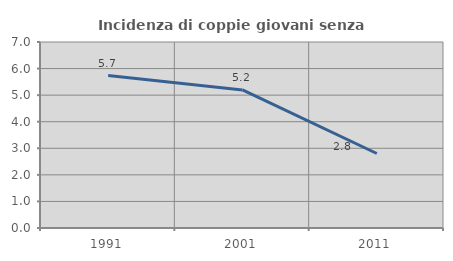
| Category | Incidenza di coppie giovani senza figli |
|---|---|
| 1991.0 | 5.738 |
| 2001.0 | 5.195 |
| 2011.0 | 2.804 |